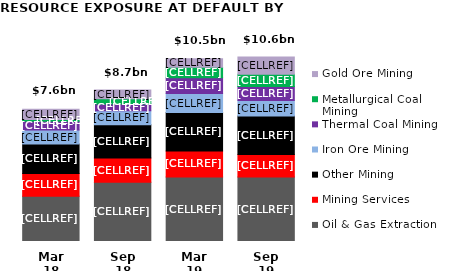
| Category | Oil & Gas Extraction | Mining Services | Other Mining | Iron Ore Mining | Thermal Coal Mining | Metallurgical Coal Mining | Gold Ore Mining |
|---|---|---|---|---|---|---|---|
| Sep 19 | 3.7 | 1.3 | 2.2 | 0.9 | 0.8 | 0.7 | 1 |
| Mar 19 | 3.7 | 1.5 | 2.2 | 1.1 | 0.9 | 0.6 | 0.5 |
| Sep 18 | 3.4 | 1.4 | 1.9 | 0.8 | 0.4 | 0.3 | 0.5 |
| Mar 18 | 2.6 | 1.3 | 1.7 | 0.8 | 0.5 | 0.1 | 0.6 |